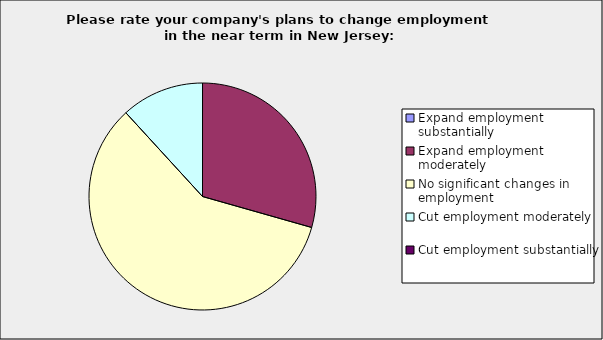
| Category | Series 0 |
|---|---|
| Expand employment substantially | 0 |
| Expand employment moderately | 0.294 |
| No significant changes in employment | 0.588 |
| Cut employment moderately | 0.118 |
| Cut employment substantially | 0 |